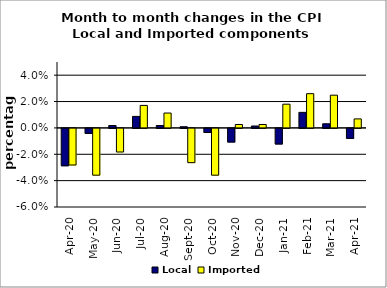
| Category | Local | Imported |
|---|---|---|
| 2020-04-01 | -0.028 | -0.028 |
| 2020-05-01 | -0.004 | -0.035 |
| 2020-06-01 | 0.002 | -0.018 |
| 2020-07-01 | 0.009 | 0.017 |
| 2020-08-01 | 0.002 | 0.011 |
| 2020-09-01 | 0.001 | -0.026 |
| 2020-10-01 | -0.003 | -0.035 |
| 2020-11-01 | -0.01 | 0.003 |
| 2020-12-01 | 0.001 | 0.003 |
| 2021-01-01 | -0.012 | 0.018 |
| 2021-02-01 | 0.012 | 0.026 |
| 2021-03-01 | 0.003 | 0.025 |
| 2021-04-01 | -0.008 | 0.007 |